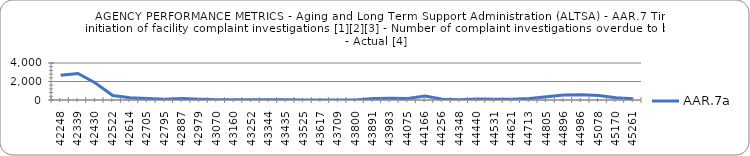
| Category | AAR.7a |
|---|---|
| 2015-09-01 | 2683 |
| 2015-12-01 | 2871 |
| 2016-03-01 | 1836 |
| 2016-06-01 | 491 |
| 2016-09-01 | 233 |
| 2016-12-01 | 173 |
| 2017-03-01 | 80 |
| 2017-06-01 | 152 |
| 2017-09-01 | 88 |
| 2017-12-01 | 25 |
| 2018-03-01 | 25 |
| 2018-06-01 | 28 |
| 2018-09-01 | 34 |
| 2018-12-01 | 33 |
| 2019-03-01 | 10 |
| 2019-06-01 | 6 |
| 2019-09-01 | 7 |
| 2019-12-01 | 8 |
| 2020-03-01 | 159 |
| 2020-06-01 | 178 |
| 2020-09-01 | 158 |
| 2020-12-01 | 432 |
| 2021-03-01 | 84 |
| 2021-06-01 | 34 |
| 2021-09-01 | 98 |
| 2021-12-01 | 68 |
| 2022-03-01 | 88 |
| 2022-06-01 | 165 |
| 2022-09-01 | 358 |
| 2022-12-01 | 533 |
| 2023-03-01 | 569 |
| 2023-06-01 | 481 |
| 2023-09-01 | 254 |
| 2023-12-01 | 132 |